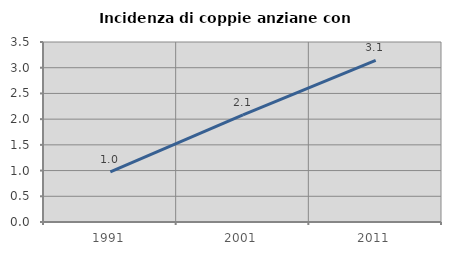
| Category | Incidenza di coppie anziane con figli |
|---|---|
| 1991.0 | 0.975 |
| 2001.0 | 2.084 |
| 2011.0 | 3.143 |